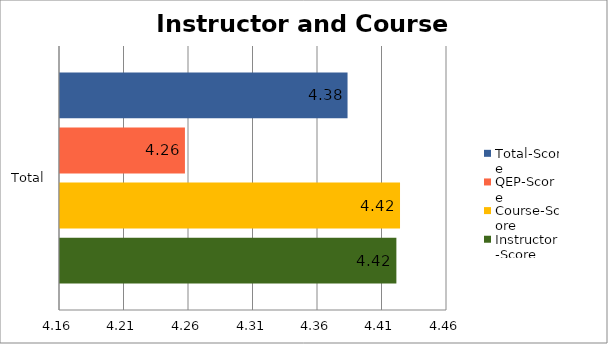
| Category | Instructor-Score | Course-Score | QEP-Score | Total-Score |
|---|---|---|---|---|
| Total | 4.421 | 4.424 | 4.257 | 4.383 |